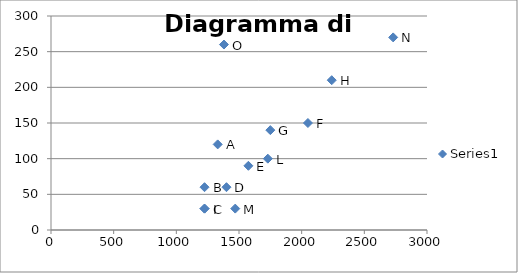
| Category | Series 0 |
|---|---|
| 1330.0 | 120 |
| 1225.0 | 60 |
| 1225.0 | 30 |
| 1400.0 | 60 |
| 1575.0 | 90 |
| 2050.0 | 150 |
| 1750.0 | 140 |
| 2240.0 | 210 |
| 1225.0 | 30 |
| 1730.0 | 100 |
| 1470.0 | 30 |
| 2730.0 | 270 |
| 1380.0 | 260 |